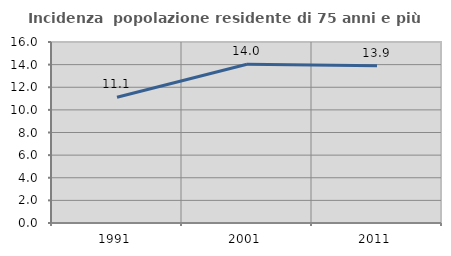
| Category | Incidenza  popolazione residente di 75 anni e più |
|---|---|
| 1991.0 | 11.111 |
| 2001.0 | 14.032 |
| 2011.0 | 13.902 |